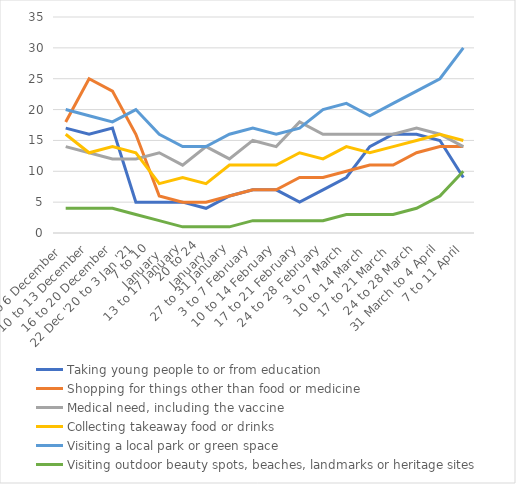
| Category | Taking young people to or from education | Shopping for things other than food or medicine | Medical need, including the vaccine | Collecting takeaway food or drinks  | Visiting a local park or green space | Visiting outdoor beauty spots, beaches, landmarks or heritage sites |
|---|---|---|---|---|---|---|
| 2 to 6 December  | 17 | 18 | 14 | 16 | 20 | 4 |
| 10 to 13 December | 16 | 25 | 13 | 13 | 19 | 4 |
| 16 to 20 December | 17 | 23 | 12 | 14 | 18 | 4 |
| 22 Dec '20 to 3 Jan '21 | 5 | 16 | 12 | 13 | 20 | 3 |
| 7 to 10 
January | 5 | 6 | 13 | 8 | 16 | 2 |
| 13 to 17 January | 5 | 5 | 11 | 9 | 14 | 1 |
| 20 to 24
January | 4 | 5 | 14 | 8 | 14 | 1 |
| 27 to 31 January | 6 | 6 | 12 | 11 | 16 | 1 |
| 3 to 7 February | 7 | 7 | 15 | 11 | 17 | 2 |
| 10 to 14 February | 7 | 7 | 14 | 11 | 16 | 2 |
| 17 to 21 February | 5 | 9 | 18 | 13 | 17 | 2 |
| 24 to 28 February | 7 | 9 | 16 | 12 | 20 | 2 |
| 3 to 7 March | 9 | 10 | 16 | 14 | 21 | 3 |
| 10 to 14 March  | 14 | 11 | 16 | 13 | 19 | 3 |
| 17 to 21 March  | 16 | 11 | 16 | 14 | 21 | 3 |
| 24 to 28 March | 16 | 13 | 17 | 15 | 23 | 4 |
| 31 March to 4 April | 15 | 14 | 16 | 16 | 25 | 6 |
| 7 to 11 April | 9 | 14 | 14 | 15 | 30 | 10 |